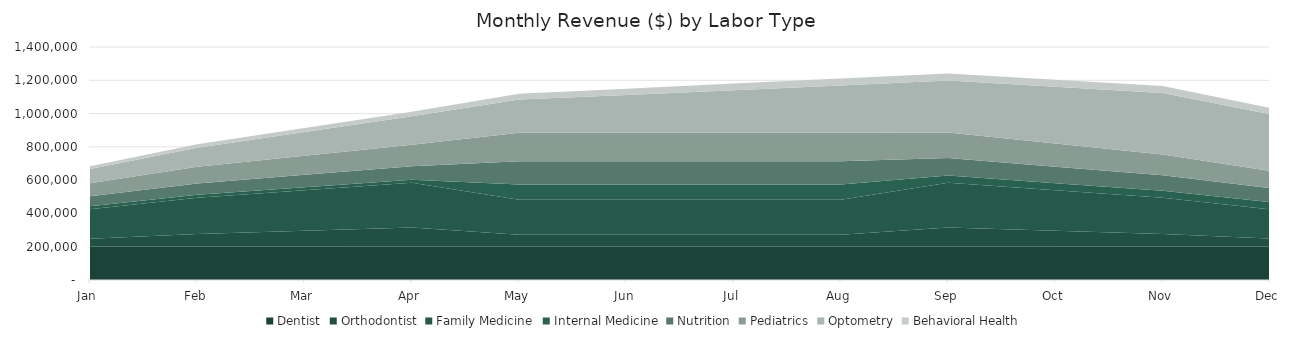
| Category | Dentist | Orthodontist | Family Medicine | Internal Medicine | Nutrition | Pediatrics | Optometry | Behavioral Health |
|---|---|---|---|---|---|---|---|---|
| Jan | 200769.167 | 47670 | 176726.667 | 18392.25 | 59047.625 | 79408.875 | 85383 | 15858.281 |
| Feb | 200769.167 | 76272 | 216490.167 | 18392.25 | 68210.188 | 100788.188 | 113844 | 20515.078 |
| Mar | 200769.167 | 95340 | 242999.167 | 18392.25 | 74318.562 | 115041.063 | 142305 | 24290.859 |
| Apr | 200769.167 | 114408 | 269508.167 | 18392.25 | 80426.937 | 129293.938 | 170766 | 28066.641 |
| May | 200769.167 | 71505 | 209862.917 | 91961.25 | 139983.594 | 170525.469 | 199227 | 35177.695 |
| Jun | 200769.167 | 71505 | 209862.917 | 91961.25 | 139983.594 | 170525.469 | 227688 | 37191.445 |
| Jul | 200769.167 | 71505 | 209862.917 | 91961.25 | 139983.594 | 170525.469 | 256149 | 39205.195 |
| Aug | 200769.167 | 71505 | 209862.917 | 91961.25 | 139983.594 | 170525.469 | 284610 | 41218.945 |
| Sep | 200769.167 | 114408 | 269508.167 | 42915.25 | 104860.438 | 153727.438 | 313071 | 41156.016 |
| Oct | 200769.167 | 95340 | 242999.167 | 42915.25 | 98752.063 | 139474.562 | 341532 | 41407.734 |
| Nov | 200769.167 | 76272 | 216490.167 | 42915.25 | 92643.688 | 125221.688 | 369993 | 41659.453 |
| Dec | 200769.167 | 47670 | 176726.667 | 42915.25 | 83481.125 | 103842.375 | 341532 | 37002.656 |